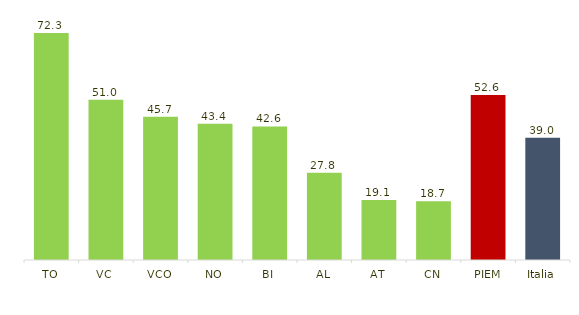
| Category | % |
|---|---|
| TO | 72.313 |
| VC | 51.039 |
| VCO | 45.677 |
| NO | 43.399 |
| BI | 42.573 |
| AL | 27.804 |
| AT | 19.123 |
| CN | 18.726 |
| PIEM | 52.617 |
| Italia | 38.974 |